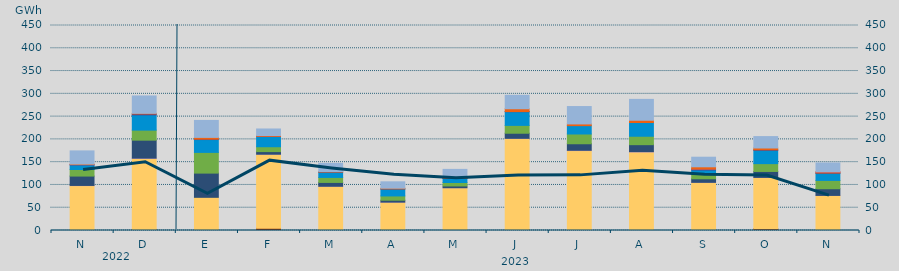
| Category | Carbón | Ciclo Combinado | Cogeneración | Consumo Bombeo | Eólica | Hidráulica | Nuclear | Otras Renovables | Solar fotovoltaica | Solar térmica | Turbinación bombeo |
|---|---|---|---|---|---|---|---|---|---|---|---|
| N | 861.375 | 97623.7 | 419.15 | 20591.575 | 14440 | 9978.175 | 722.075 | 1 | 1239.075 | 0 | 28866.575 |
| D | 2372.95 | 155746.55 | 697.65 | 39478.975 | 22031.425 | 33537.4 | 2006.425 | 0 | 1334.875 | 0 | 38128.575 |
| E | 1284.5 | 71547.4 | 0 | 53164.775 | 45462.95 | 28173.35 | 832.7 | 0 | 3920.525 | 0 | 37262.825 |
| F | 5209.75 | 162258.025 | 4.5 | 5734.4 | 10650.1 | 22890.65 | 0 | 26 | 1697.2 | 0 | 14370.575 |
| M | 1206.25 | 95878.75 | 28.525 | 8412.525 | 10950.5 | 11649.375 | 291.075 | 0 | 997.65 | 0 | 18026.625 |
| A | 95 | 62173.25 | 34.425 | 4159.95 | 9407.775 | 15400.95 | 65.5 | 0 | 1513.55 | 0 | 13985.1 |
| M | 53 | 93854.15 | 22.625 | 3893.75 | 7479.975 | 9063.875 | 377.575 | 0 | 1716.575 | 0 | 17696.4 |
| J | 1199.5 | 200824.35 | 314.8 | 11178.5 | 17206.65 | 30102.475 | 201.5 | 0 | 6216.85 | 0 | 29529.225 |
| J | 468.8 | 174954.2 | 648.625 | 14357.5 | 21420.05 | 18314.475 | 0 | 0 | 3759.55 | 0 | 38182.8 |
| A | 2071.15 | 170328.85 | 646.325 | 15367.25 | 18494.75 | 30120.575 | 0 | 0 | 4976.775 | 0 | 45807.425 |
| S | 242.5 | 105492.6 | 2.25 | 7781 | 9960.15 | 9303.9 | 1998.5 | 2 | 5033.1 | 0 | 21057.1 |
| O | 4030.7 | 112340.225 | 164.75 | 13063.5 | 17178.525 | 29288.975 | 1045.75 | 0 | 3984.725 | 0 | 25044.625 |
| N | 242.3 | 76778.675 | 2 | 14633.45 | 18267.525 | 15599.125 | 750.425 | 0 | 2214.45 | 2 | 19792.325 |